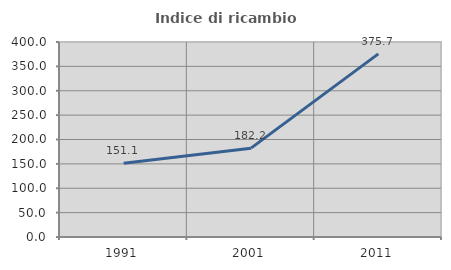
| Category | Indice di ricambio occupazionale  |
|---|---|
| 1991.0 | 151.064 |
| 2001.0 | 182.222 |
| 2011.0 | 375.676 |